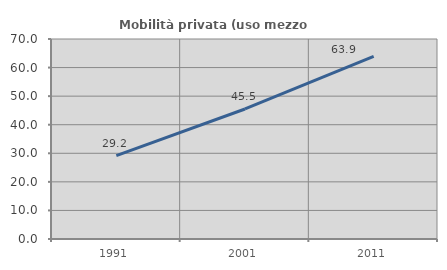
| Category | Mobilità privata (uso mezzo privato) |
|---|---|
| 1991.0 | 29.169 |
| 2001.0 | 45.505 |
| 2011.0 | 63.937 |